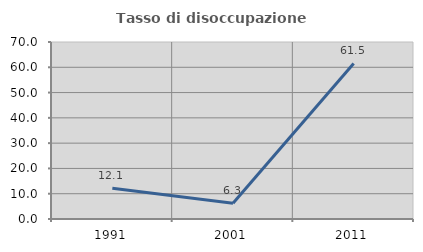
| Category | Tasso di disoccupazione giovanile  |
|---|---|
| 1991.0 | 12.121 |
| 2001.0 | 6.25 |
| 2011.0 | 61.538 |